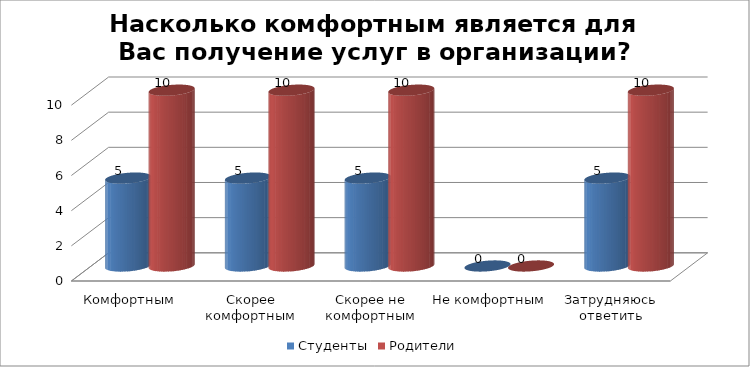
| Category | Студенты | Родители |
|---|---|---|
| Комфортным | 5 | 10 |
| Скорее комфортным | 5 | 10 |
| Скорее не комфортным | 5 | 10 |
| Не комфортным | 0 | 0 |
| Затрудняюсь ответить | 5 | 10 |